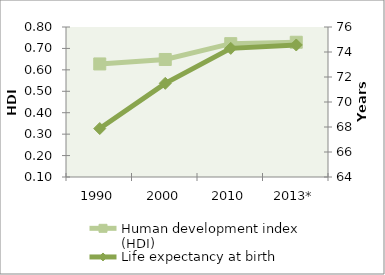
| Category | Human development index (HDI) |
|---|---|
| 1990 | 0.628 |
| 2000 | 0.648 |
| 2010 | 0.722 |
| 2013* | 0.729 |